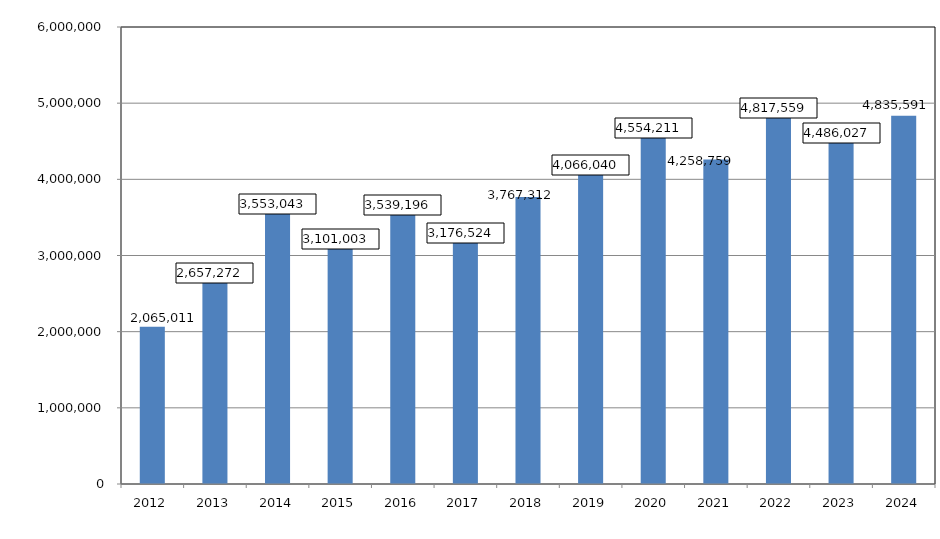
| Category | Series 0 |
|---|---|
| 2012.0 | 2065011 |
| 2013.0 | 2657272 |
| 2014.0 | 3553043 |
| 2015.0 | 3101003 |
| 2016.0 | 3539196 |
| 2017.0 | 3176524 |
| 2018.0 | 3767312 |
| 2019.0 | 4066040 |
| 2020.0 | 4554211 |
| 2021.0 | 4258759 |
| 2022.0 | 4817559 |
| 2023.0 | 4486027 |
| 2024.0 | 4835591 |